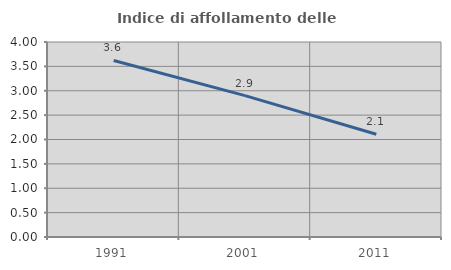
| Category | Indice di affollamento delle abitazioni  |
|---|---|
| 1991.0 | 3.621 |
| 2001.0 | 2.9 |
| 2011.0 | 2.108 |